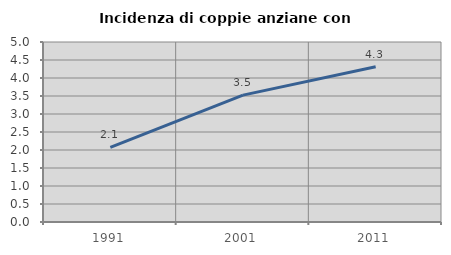
| Category | Incidenza di coppie anziane con figli |
|---|---|
| 1991.0 | 2.074 |
| 2001.0 | 3.525 |
| 2011.0 | 4.31 |